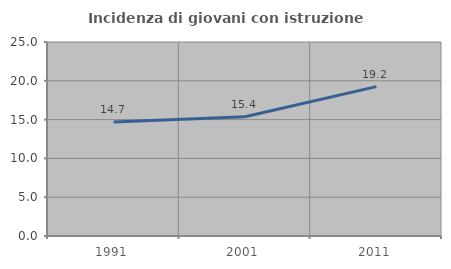
| Category | Incidenza di giovani con istruzione universitaria |
|---|---|
| 1991.0 | 14.696 |
| 2001.0 | 15.361 |
| 2011.0 | 19.245 |